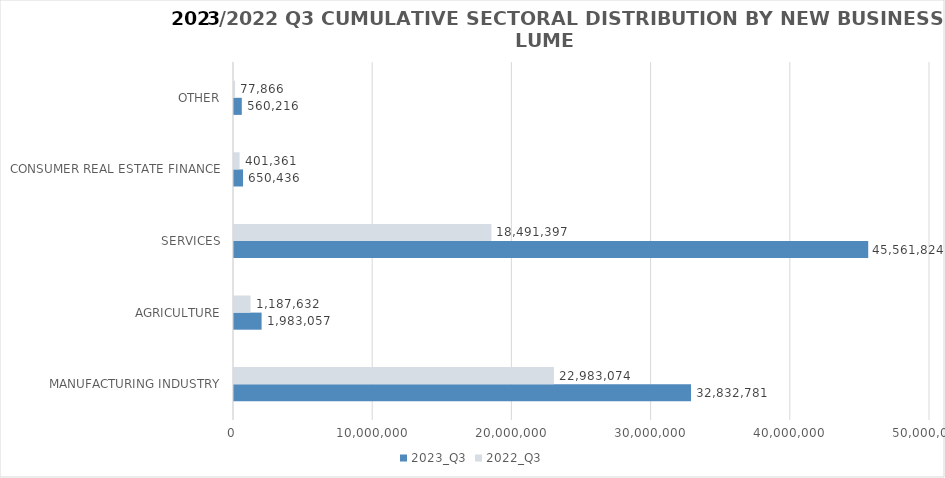
| Category | 2023_Q3 | 2022_Q3 |
|---|---|---|
| MANUFACTURING INDUSTRY | 32832780.57 | 22983073.606 |
| AGRICULTURE | 1983056.96 | 1187632.025 |
| SERVICES | 45561823.588 | 18491397.437 |
| CONSUMER REAL ESTATE FINANCE | 650436 | 401361 |
| OTHER | 560216 | 77866 |